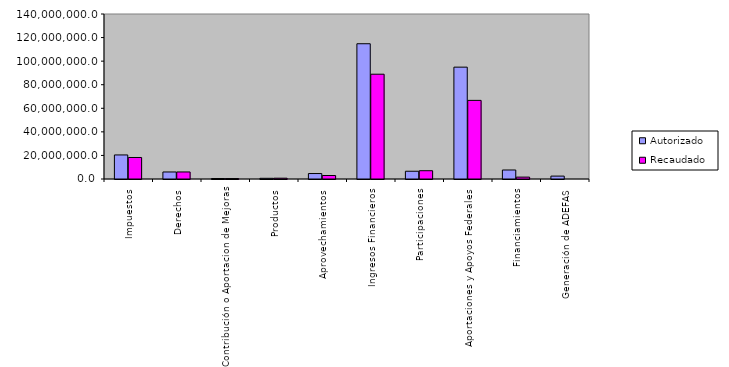
| Category | Autorizado | Recaudado |
|---|---|---|
| Impuestos | 20407536 | 18243591.9 |
| Derechos | 5965480.3 | 5968282.9 |
| Contribución o Aportacion de Mejoras | 421290.3 | 380228.8 |
| Productos | 591994.7 | 687498.1 |
| Aprovechamientos | 4631664.6 | 2962049.1 |
| Ingresos Financieros | 114764158.7 | 88914231.8 |
| Participaciones | 6584458 | 7033264.5 |
| Aportaciones y Apoyos Federales | 94908676.1 | 66701571 |
| Financiamientos | 7639931.6 | 1602461.56 |
| Generación de ADEFAS | 2460661.3 | 0 |